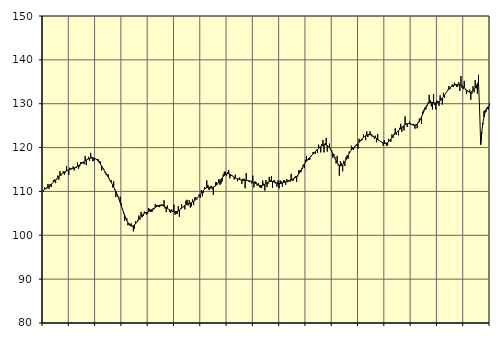
| Category | Samtliga anställda (inkl. anställda utomlands) | Series 1 |
|---|---|---|
| nan | 109.9 | 110.31 |
| 87.0 | 110.9 | 110.48 |
| 87.0 | 110.6 | 110.64 |
| 87.0 | 110.6 | 110.84 |
| 87.0 | 111.7 | 111.03 |
| 87.0 | 110.6 | 111.23 |
| 87.0 | 111.7 | 111.43 |
| 87.0 | 111 | 111.65 |
| 87.0 | 111.9 | 111.87 |
| 87.0 | 112.6 | 112.1 |
| 87.0 | 112.7 | 112.35 |
| 87.0 | 111.9 | 112.61 |
| nan | 112.7 | 112.87 |
| 88.0 | 113.6 | 113.13 |
| 88.0 | 112.7 | 113.39 |
| 88.0 | 114.6 | 113.63 |
| 88.0 | 113.6 | 113.85 |
| 88.0 | 114 | 114.06 |
| 88.0 | 114.6 | 114.24 |
| 88.0 | 113.8 | 114.41 |
| 88.0 | 114.3 | 114.56 |
| 88.0 | 115.8 | 114.69 |
| 88.0 | 114.7 | 114.8 |
| 88.0 | 113.8 | 114.9 |
| nan | 115.4 | 114.99 |
| 89.0 | 115.3 | 115.08 |
| 89.0 | 115.2 | 115.17 |
| 89.0 | 115.7 | 115.26 |
| 89.0 | 114.8 | 115.36 |
| 89.0 | 115.3 | 115.48 |
| 89.0 | 115.4 | 115.61 |
| 89.0 | 116.6 | 115.76 |
| 89.0 | 115.2 | 115.92 |
| 89.0 | 115.7 | 116.08 |
| 89.0 | 116.7 | 116.25 |
| 89.0 | 116.7 | 116.43 |
| nan | 116.7 | 116.63 |
| 90.0 | 116.2 | 116.82 |
| 90.0 | 118.1 | 117 |
| 90.0 | 116 | 117.16 |
| 90.0 | 117.2 | 117.3 |
| 90.0 | 117.9 | 117.42 |
| 90.0 | 117 | 117.52 |
| 90.0 | 118.8 | 117.59 |
| 90.0 | 117.9 | 117.63 |
| 90.0 | 116.9 | 117.64 |
| 90.0 | 117 | 117.6 |
| 90.0 | 117.6 | 117.51 |
| nan | 117.4 | 117.36 |
| 91.0 | 117.4 | 117.15 |
| 91.0 | 117.3 | 116.88 |
| 91.0 | 116.9 | 116.56 |
| 91.0 | 116.8 | 116.2 |
| 91.0 | 114.8 | 115.8 |
| 91.0 | 115.2 | 115.38 |
| 91.0 | 115.1 | 114.94 |
| 91.0 | 114.3 | 114.52 |
| 91.0 | 113.8 | 114.1 |
| 91.0 | 113.6 | 113.7 |
| 91.0 | 113.9 | 113.3 |
| nan | 112.7 | 112.88 |
| 92.0 | 112.2 | 112.44 |
| 92.0 | 112.5 | 111.98 |
| 92.0 | 110.9 | 111.51 |
| 92.0 | 112.3 | 111.02 |
| 92.0 | 110.3 | 110.51 |
| 92.0 | 108.7 | 109.98 |
| 92.0 | 109.3 | 109.41 |
| 92.0 | 108.9 | 108.8 |
| 92.0 | 108.2 | 108.14 |
| 92.0 | 108.8 | 107.44 |
| 92.0 | 107.3 | 106.72 |
| nan | 105.9 | 105.99 |
| 93.0 | 104.9 | 105.27 |
| 93.0 | 103.3 | 104.58 |
| 93.0 | 103.9 | 103.94 |
| 93.0 | 103.9 | 103.36 |
| 93.0 | 102.3 | 102.87 |
| 93.0 | 102.7 | 102.49 |
| 93.0 | 102.6 | 102.24 |
| 93.0 | 102.7 | 102.11 |
| 93.0 | 102 | 102.1 |
| 93.0 | 100.9 | 102.19 |
| 93.0 | 101.5 | 102.37 |
| nan | 103.2 | 102.63 |
| 94.0 | 102.9 | 102.95 |
| 94.0 | 103.5 | 103.3 |
| 94.0 | 104.5 | 103.66 |
| 94.0 | 103.6 | 104.01 |
| 94.0 | 105.3 | 104.32 |
| 94.0 | 104.1 | 104.59 |
| 94.0 | 104.4 | 104.8 |
| 94.0 | 105.4 | 104.96 |
| 94.0 | 105.3 | 105.08 |
| 94.0 | 104.7 | 105.18 |
| 94.0 | 104.9 | 105.3 |
| nan | 106.2 | 105.43 |
| 95.0 | 106 | 105.57 |
| 95.0 | 105.3 | 105.72 |
| 95.0 | 105.3 | 105.88 |
| 95.0 | 105.8 | 106.04 |
| 95.0 | 106 | 106.21 |
| 95.0 | 107.1 | 106.37 |
| 95.0 | 106.9 | 106.53 |
| 95.0 | 106.8 | 106.67 |
| 95.0 | 106.5 | 106.78 |
| 95.0 | 106.4 | 106.85 |
| 95.0 | 106.7 | 106.88 |
| nan | 107.1 | 106.84 |
| 96.0 | 106.8 | 106.75 |
| 96.0 | 108 | 106.61 |
| 96.0 | 106.1 | 106.46 |
| 96.0 | 105.3 | 106.3 |
| 96.0 | 106.8 | 106.13 |
| 96.0 | 105.9 | 105.96 |
| 96.0 | 105.4 | 105.79 |
| 96.0 | 105.1 | 105.64 |
| 96.0 | 105.9 | 105.52 |
| 96.0 | 105.3 | 105.43 |
| 96.0 | 107 | 105.39 |
| nan | 104.7 | 105.38 |
| 97.0 | 104.9 | 105.4 |
| 97.0 | 104.9 | 105.46 |
| 97.0 | 106.6 | 105.57 |
| 97.0 | 104.2 | 105.73 |
| 97.0 | 106.1 | 105.94 |
| 97.0 | 107.1 | 106.17 |
| 97.0 | 106.4 | 106.41 |
| 97.0 | 106.4 | 106.63 |
| 97.0 | 105.9 | 106.83 |
| 97.0 | 107.9 | 106.98 |
| 97.0 | 108.1 | 107.08 |
| nan | 106.8 | 107.17 |
| 98.0 | 108 | 107.25 |
| 98.0 | 106.3 | 107.33 |
| 98.0 | 106.6 | 107.45 |
| 98.0 | 108.2 | 107.59 |
| 98.0 | 106.9 | 107.76 |
| 98.0 | 108.6 | 107.95 |
| 98.0 | 108.7 | 108.15 |
| 98.0 | 108.2 | 108.39 |
| 98.0 | 108.7 | 108.67 |
| 98.0 | 109.3 | 108.97 |
| 98.0 | 108.5 | 109.29 |
| nan | 110.3 | 109.62 |
| 99.0 | 108.9 | 109.95 |
| 99.0 | 109.7 | 110.26 |
| 99.0 | 111 | 110.52 |
| 99.0 | 110.8 | 110.73 |
| 99.0 | 112.5 | 110.86 |
| 99.0 | 111.5 | 110.92 |
| 99.0 | 110.3 | 110.95 |
| 99.0 | 110.6 | 110.95 |
| 99.0 | 111.3 | 110.95 |
| 99.0 | 110.5 | 110.96 |
| 99.0 | 109.2 | 111 |
| nan | 111.2 | 111.1 |
| 0.0 | 112.1 | 111.26 |
| 0.0 | 112.1 | 111.48 |
| 0.0 | 111.8 | 111.76 |
| 0.0 | 112.8 | 112.08 |
| 0.0 | 111.5 | 112.41 |
| 0.0 | 111.8 | 112.75 |
| 0.0 | 112.3 | 113.08 |
| 0.0 | 113.9 | 113.38 |
| 0.0 | 114.5 | 113.64 |
| 0.0 | 114.5 | 113.84 |
| 0.0 | 113.5 | 113.97 |
| nan | 114.4 | 114.04 |
| 1.0 | 114.9 | 114.02 |
| 1.0 | 113 | 113.92 |
| 1.0 | 113.5 | 113.77 |
| 1.0 | 113.7 | 113.59 |
| 1.0 | 113.4 | 113.41 |
| 1.0 | 112.7 | 113.24 |
| 1.0 | 113.8 | 113.1 |
| 1.0 | 112.9 | 112.97 |
| 1.0 | 112.3 | 112.86 |
| 1.0 | 112.9 | 112.77 |
| 1.0 | 113.2 | 112.69 |
| nan | 112.7 | 112.63 |
| 2.0 | 111.7 | 112.58 |
| 2.0 | 112.9 | 112.54 |
| 2.0 | 112.9 | 112.52 |
| 2.0 | 110.7 | 112.5 |
| 2.0 | 114.2 | 112.49 |
| 2.0 | 112.6 | 112.47 |
| 2.0 | 112.3 | 112.45 |
| 2.0 | 112.1 | 112.42 |
| 2.0 | 112.4 | 112.36 |
| 2.0 | 111.8 | 112.27 |
| 2.0 | 113.6 | 112.16 |
| nan | 110.9 | 112.03 |
| 3.0 | 112.3 | 111.89 |
| 3.0 | 112.1 | 111.75 |
| 3.0 | 111.3 | 111.62 |
| 3.0 | 111.9 | 111.5 |
| 3.0 | 111 | 111.4 |
| 3.0 | 110.8 | 111.33 |
| 3.0 | 110.8 | 111.32 |
| 3.0 | 112.5 | 111.36 |
| 3.0 | 111.8 | 111.46 |
| 3.0 | 110.2 | 111.6 |
| 3.0 | 112.6 | 111.77 |
| nan | 111 | 111.94 |
| 4.0 | 111.8 | 112.1 |
| 4.0 | 113.3 | 112.22 |
| 4.0 | 112.6 | 112.28 |
| 4.0 | 113.5 | 112.29 |
| 4.0 | 110.8 | 112.25 |
| 4.0 | 112.5 | 112.18 |
| 4.0 | 112.5 | 112.08 |
| 4.0 | 111.8 | 111.98 |
| 4.0 | 111.1 | 111.88 |
| 4.0 | 112.5 | 111.82 |
| 4.0 | 110.7 | 111.8 |
| nan | 112.5 | 111.81 |
| 5.0 | 112.3 | 111.86 |
| 5.0 | 111.1 | 111.94 |
| 5.0 | 112.5 | 112.02 |
| 5.0 | 112.5 | 112.11 |
| 5.0 | 111.5 | 112.21 |
| 5.0 | 112.8 | 112.31 |
| 5.0 | 112.1 | 112.4 |
| 5.0 | 112.4 | 112.48 |
| 5.0 | 112.2 | 112.56 |
| 5.0 | 114 | 112.65 |
| 5.0 | 112.4 | 112.75 |
| nan | 112.5 | 112.87 |
| 6.0 | 113.3 | 113.02 |
| 6.0 | 113.5 | 113.2 |
| 6.0 | 112.2 | 113.43 |
| 6.0 | 113.4 | 113.71 |
| 6.0 | 114.8 | 114.05 |
| 6.0 | 114.8 | 114.45 |
| 6.0 | 114.4 | 114.88 |
| 6.0 | 115.1 | 115.32 |
| 6.0 | 116.1 | 115.76 |
| 6.0 | 115.3 | 116.18 |
| 6.0 | 117.2 | 116.57 |
| nan | 118.1 | 116.92 |
| 7.0 | 117.1 | 117.23 |
| 7.0 | 117.2 | 117.52 |
| 7.0 | 117.2 | 117.79 |
| 7.0 | 117.9 | 118.05 |
| 7.0 | 118.3 | 118.3 |
| 7.0 | 119 | 118.54 |
| 7.0 | 119 | 118.78 |
| 7.0 | 118.5 | 119.03 |
| 7.0 | 119.5 | 119.29 |
| 7.0 | 118.8 | 119.54 |
| 7.0 | 120.7 | 119.79 |
| nan | 120.2 | 120 |
| 8.0 | 118.9 | 120.2 |
| 8.0 | 120.8 | 120.38 |
| 8.0 | 121.7 | 120.52 |
| 8.0 | 118.9 | 120.62 |
| 8.0 | 121 | 120.65 |
| 8.0 | 122.2 | 120.6 |
| 8.0 | 119.1 | 120.48 |
| 8.0 | 120.2 | 120.27 |
| 8.0 | 120.9 | 119.97 |
| 8.0 | 119.7 | 119.59 |
| 8.0 | 119.4 | 119.14 |
| nan | 117.7 | 118.63 |
| 9.0 | 118.5 | 118.09 |
| 9.0 | 117.8 | 117.55 |
| 9.0 | 116.4 | 117.03 |
| 9.0 | 118.1 | 116.57 |
| 9.0 | 115.9 | 116.21 |
| 9.0 | 113.6 | 115.96 |
| 9.0 | 116.9 | 115.83 |
| 9.0 | 116.5 | 115.86 |
| 9.0 | 114.6 | 116.03 |
| 9.0 | 117 | 116.33 |
| 9.0 | 115.8 | 116.73 |
| nan | 117.8 | 117.2 |
| 10.0 | 118.2 | 117.71 |
| 10.0 | 117.4 | 118.21 |
| 10.0 | 119.1 | 118.67 |
| 10.0 | 119.1 | 119.08 |
| 10.0 | 120.4 | 119.42 |
| 10.0 | 120 | 119.71 |
| 10.0 | 119.5 | 119.97 |
| 10.0 | 119.9 | 120.21 |
| 10.0 | 120.6 | 120.44 |
| 10.0 | 120.4 | 120.68 |
| 10.0 | 119.7 | 120.94 |
| nan | 122 | 121.19 |
| 11.0 | 121.7 | 121.47 |
| 11.0 | 121.6 | 121.77 |
| 11.0 | 121.8 | 122.06 |
| 11.0 | 123 | 122.33 |
| 11.0 | 122.6 | 122.57 |
| 11.0 | 121.7 | 122.75 |
| 11.0 | 123.7 | 122.87 |
| 11.0 | 122.4 | 122.94 |
| 11.0 | 123.1 | 122.95 |
| 11.0 | 123.7 | 122.92 |
| 11.0 | 123.1 | 122.85 |
| nan | 122.5 | 122.74 |
| 12.0 | 122.4 | 122.6 |
| 12.0 | 122 | 122.44 |
| 12.0 | 122.7 | 122.26 |
| 12.0 | 121.2 | 122.08 |
| 12.0 | 123.1 | 121.88 |
| 12.0 | 121.6 | 121.69 |
| 12.0 | 121.5 | 121.5 |
| 12.0 | 121.3 | 121.33 |
| 12.0 | 121.1 | 121.18 |
| 12.0 | 120.4 | 121.05 |
| 12.0 | 121.7 | 120.97 |
| nan | 121.1 | 120.95 |
| 13.0 | 120.4 | 121.02 |
| 13.0 | 120.5 | 121.17 |
| 13.0 | 122 | 121.38 |
| 13.0 | 121.6 | 121.65 |
| 13.0 | 121.3 | 121.95 |
| 13.0 | 123 | 122.28 |
| 13.0 | 122.2 | 122.6 |
| 13.0 | 123.2 | 122.89 |
| 13.0 | 124.4 | 123.17 |
| 13.0 | 122.9 | 123.43 |
| 13.0 | 123.6 | 123.67 |
| nan | 122.8 | 123.89 |
| 14.0 | 124.5 | 124.11 |
| 14.0 | 125.4 | 124.33 |
| 14.0 | 123.6 | 124.55 |
| 14.0 | 124.6 | 124.78 |
| 14.0 | 123.9 | 124.99 |
| 14.0 | 127.1 | 125.19 |
| 14.0 | 125.5 | 125.34 |
| 14.0 | 124.7 | 125.43 |
| 14.0 | 125.5 | 125.46 |
| 14.0 | 125.9 | 125.42 |
| 14.0 | 125.6 | 125.36 |
| nan | 125.2 | 125.26 |
| 15.0 | 125.4 | 125.17 |
| 15.0 | 125.3 | 125.1 |
| 15.0 | 124.3 | 125.1 |
| 15.0 | 125.3 | 125.18 |
| 15.0 | 124.4 | 125.35 |
| 15.0 | 125.9 | 125.62 |
| 15.0 | 126.6 | 125.98 |
| 15.0 | 126.5 | 126.46 |
| 15.0 | 125.4 | 127.01 |
| 15.0 | 128.2 | 127.6 |
| 15.0 | 128.6 | 128.2 |
| nan | 129.1 | 128.77 |
| 16.0 | 128.7 | 129.28 |
| 16.0 | 129.4 | 129.69 |
| 16.0 | 130.3 | 130 |
| 16.0 | 132 | 130.2 |
| 16.0 | 130.8 | 130.3 |
| 16.0 | 129.4 | 130.32 |
| 16.0 | 128.7 | 130.28 |
| 16.0 | 132.2 | 130.21 |
| 16.0 | 129.7 | 130.17 |
| 16.0 | 128.7 | 130.15 |
| 16.0 | 130.7 | 130.18 |
| nan | 130.6 | 130.28 |
| 17.0 | 129.5 | 130.45 |
| 17.0 | 131.9 | 130.68 |
| 17.0 | 131.2 | 130.96 |
| 17.0 | 129.8 | 131.28 |
| 17.0 | 132.5 | 131.62 |
| 17.0 | 131.4 | 131.98 |
| 17.0 | 132.4 | 132.35 |
| 17.0 | 132.7 | 132.72 |
| 17.0 | 133.2 | 133.06 |
| 17.0 | 134 | 133.37 |
| 17.0 | 133.3 | 133.64 |
| nan | 133.8 | 133.86 |
| 18.0 | 134.4 | 134.03 |
| 18.0 | 133.8 | 134.15 |
| 18.0 | 134.8 | 134.24 |
| 18.0 | 134.5 | 134.3 |
| 18.0 | 133.8 | 134.35 |
| 18.0 | 133.9 | 134.36 |
| 18.0 | 134.9 | 134.35 |
| 18.0 | 132.9 | 134.31 |
| 18.0 | 136.3 | 134.22 |
| 18.0 | 133.6 | 134.08 |
| 18.0 | 133.3 | 133.88 |
| nan | 135.2 | 133.63 |
| 19.0 | 133.2 | 133.37 |
| 19.0 | 132.2 | 133.11 |
| 19.0 | 133 | 132.87 |
| 19.0 | 132.8 | 132.7 |
| 19.0 | 133.2 | 132.61 |
| 19.0 | 130.9 | 132.62 |
| 19.0 | 132.3 | 132.74 |
| 19.0 | 134 | 132.95 |
| 19.0 | 132.6 | 133.25 |
| 19.0 | 135.4 | 133.62 |
| 19.0 | 133.5 | 134.05 |
| nan | 132.3 | 134.51 |
| 20.0 | 136.6 | 134.96 |
| 20.0 | 128.9 | 128.8 |
| 20.0 | 120.6 | 120.7 |
| 20.0 | 123.4 | 123.56 |
| 20.0 | 125.3 | 125.59 |
| 20.0 | 128.3 | 127.01 |
| 20.0 | 128.5 | 128 |
| 20.0 | 128.2 | 128.67 |
| 20.0 | 128.8 | 129.12 |
| 20.0 | 128.7 | 129.41 |
| 20.0 | 130.1 | 129.61 |